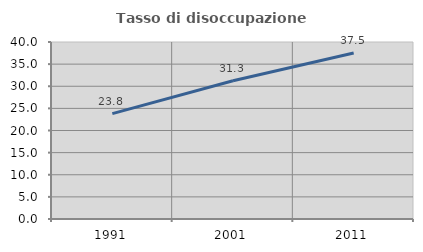
| Category | Tasso di disoccupazione giovanile  |
|---|---|
| 1991.0 | 23.81 |
| 2001.0 | 31.25 |
| 2011.0 | 37.5 |